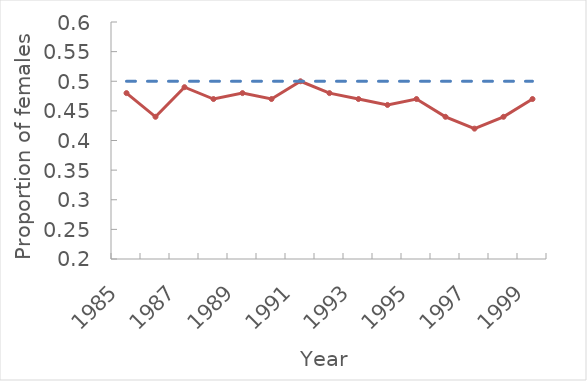
| Category | Sex Ratio | Series 0 |
|---|---|---|
| 1985.0 | 0.48 | 0.5 |
| 1986.0 | 0.44 | 0.5 |
| 1987.0 | 0.49 | 0.5 |
| 1988.0 | 0.47 | 0.5 |
| 1989.0 | 0.48 | 0.5 |
| 1990.0 | 0.47 | 0.5 |
| 1991.0 | 0.5 | 0.5 |
| 1992.0 | 0.48 | 0.5 |
| 1993.0 | 0.47 | 0.5 |
| 1994.0 | 0.46 | 0.5 |
| 1995.0 | 0.47 | 0.5 |
| 1996.0 | 0.44 | 0.5 |
| 1997.0 | 0.42 | 0.5 |
| 1998.0 | 0.44 | 0.5 |
| 1999.0 | 0.47 | 0.5 |